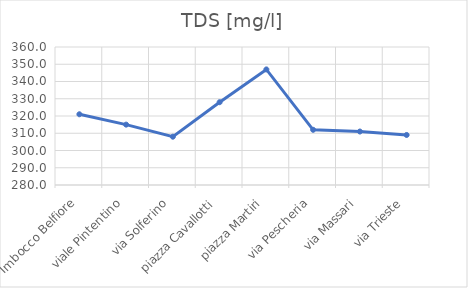
| Category | TDS [mg/l] |
|---|---|
| Imbocco Belfiore | 321 |
| viale Pintentino | 315 |
| via Solferino | 308 |
| piazza Cavallotti | 328 |
| piazza Martiri | 347 |
| via Pescheria | 312 |
| via Massari | 311 |
| via Trieste | 309 |